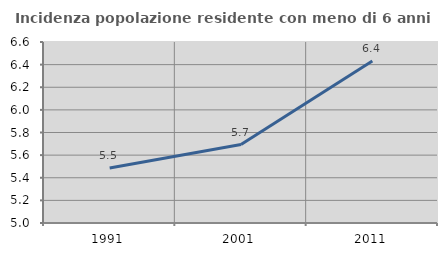
| Category | Incidenza popolazione residente con meno di 6 anni |
|---|---|
| 1991.0 | 5.486 |
| 2001.0 | 5.693 |
| 2011.0 | 6.433 |